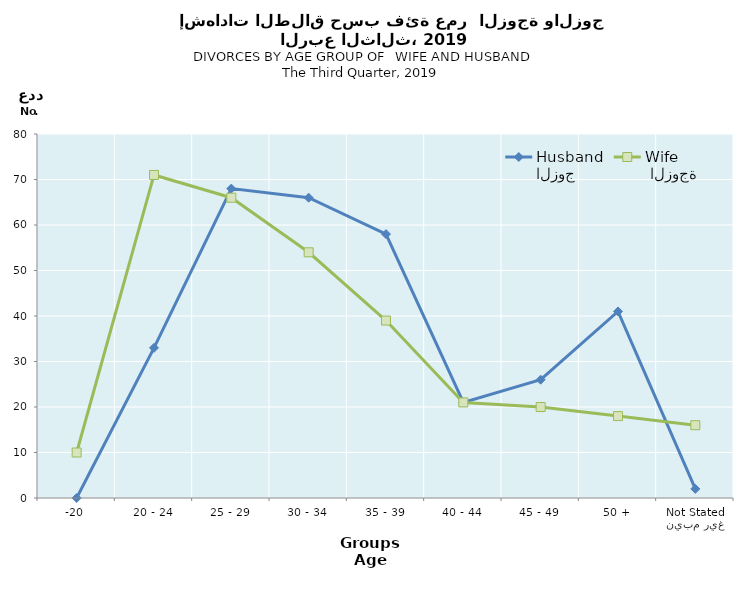
| Category | الزوج
Husband |  الزوجة
Wife |
|---|---|---|
| -20 | 0 | 10 |
| 20 - 24 | 33 | 71 |
| 25 - 29 | 68 | 66 |
| 30 - 34 | 66 | 54 |
| 35 - 39 | 58 | 39 |
| 40 - 44 | 21 | 21 |
| 45 - 49 | 26 | 20 |
| 50 + | 41 | 18 |
| غير مبين
Not Stated | 2 | 16 |